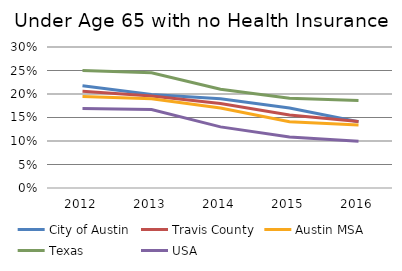
| Category | City of Austin | Travis County | Austin MSA | Texas | USA |
|---|---|---|---|---|---|
| 2012.0 | 0.218 | 0.206 | 0.194 | 0.25 | 0.169 |
| 2013.0 | 0.199 | 0.196 | 0.19 | 0.245 | 0.167 |
| 2014.0 | 0.19 | 0.18 | 0.17 | 0.21 | 0.13 |
| 2015.0 | 0.17 | 0.155 | 0.141 | 0.191 | 0.109 |
| 2016.0 | 0.141 | 0.142 | 0.134 | 0.186 | 0.1 |